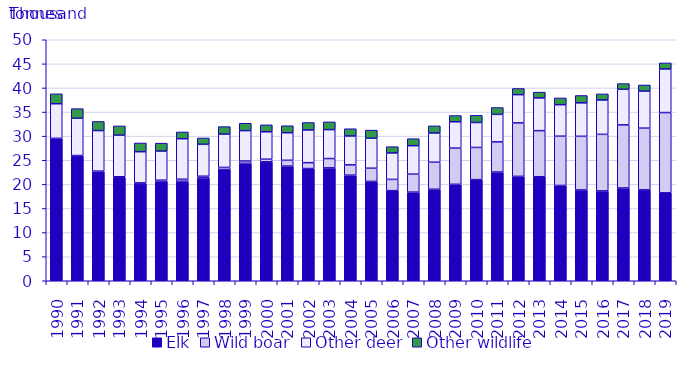
| Category | Elk | Wild boar | Other deer | Other wildlife |
|---|---|---|---|---|
| 1990.0 | 29.516 | 0.038 | 7.172 | 2.058 |
| 1991.0 | 25.913 | 0.066 | 7.734 | 1.995 |
| 1992.0 | 22.67 | 0.073 | 8.416 | 1.885 |
| 1993.0 | 21.398 | 0.178 | 8.637 | 1.903 |
| 1994.0 | 20.117 | 0.187 | 6.471 | 1.808 |
| 1995.0 | 20.688 | 0.173 | 6.051 | 1.637 |
| 1996.0 | 20.644 | 0.419 | 8.402 | 1.405 |
| 1997.0 | 21.34 | 0.347 | 6.62 | 1.314 |
| 1998.0 | 23.061 | 0.451 | 6.923 | 1.547 |
| 1999.0 | 24.364 | 0.477 | 6.306 | 1.536 |
| 2000.0 | 24.676 | 0.539 | 5.693 | 1.438 |
| 2001.0 | 23.79 | 1.198 | 5.726 | 1.445 |
| 2002.0 | 23.278 | 1.222 | 6.787 | 1.542 |
| 2003.0 | 23.415 | 1.941 | 6.001 | 1.602 |
| 2004.0 | 21.905 | 2.139 | 5.993 | 1.502 |
| 2005.0 | 20.615 | 2.732 | 6.232 | 1.674 |
| 2006.0 | 18.701 | 2.328 | 5.489 | 1.3 |
| 2007.0 | 18.385 | 3.733 | 5.903 | 1.451 |
| 2008.0 | 18.981 | 5.617 | 6.064 | 1.474 |
| 2009.0 | 20.007 | 7.509 | 5.467 | 1.296 |
| 2010.0 | 20.985 | 6.672 | 5.173 | 1.495 |
| 2011.0 | 22.547 | 6.262 | 5.709 | 1.424 |
| 2012.0 | 21.658 | 11.091 | 5.858 | 1.282 |
| 2013.0 | 21.582 | 9.562 | 6.793 | 1.197 |
| 2014.0 | 19.77 | 10.219 | 6.536 | 1.401 |
| 2015.0 | 18.84 | 11.129 | 6.942 | 1.525 |
| 2016.0 | 18.641 | 11.733 | 7.134 | 1.255 |
| 2017.0 | 19.246 | 13.091 | 7.39 | 1.178 |
| 2018.0 | 18.854 | 12.808 | 7.686 | 1.268 |
| 2019.0 | 18.24 | 16.652 | 9.052 | 1.246 |